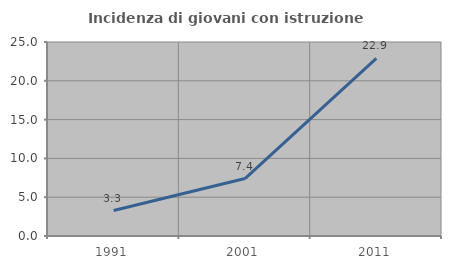
| Category | Incidenza di giovani con istruzione universitaria |
|---|---|
| 1991.0 | 3.279 |
| 2001.0 | 7.407 |
| 2011.0 | 22.892 |